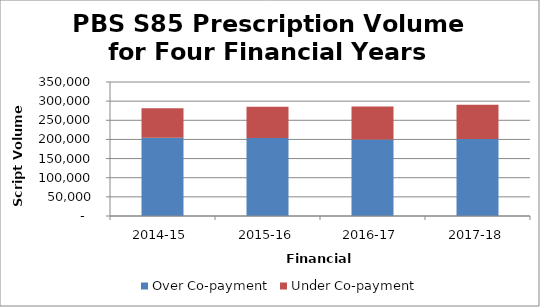
| Category | Over Co‐payment | Under Co‐payment |
|---|---|---|
| 2014-15 | 204431968 | 76739457 |
| 2015-16 | 204003266 | 81426548 |
| 2016-17 | 199781324 | 86195858 |
| 2017-18 | 201413857 | 89432000 |